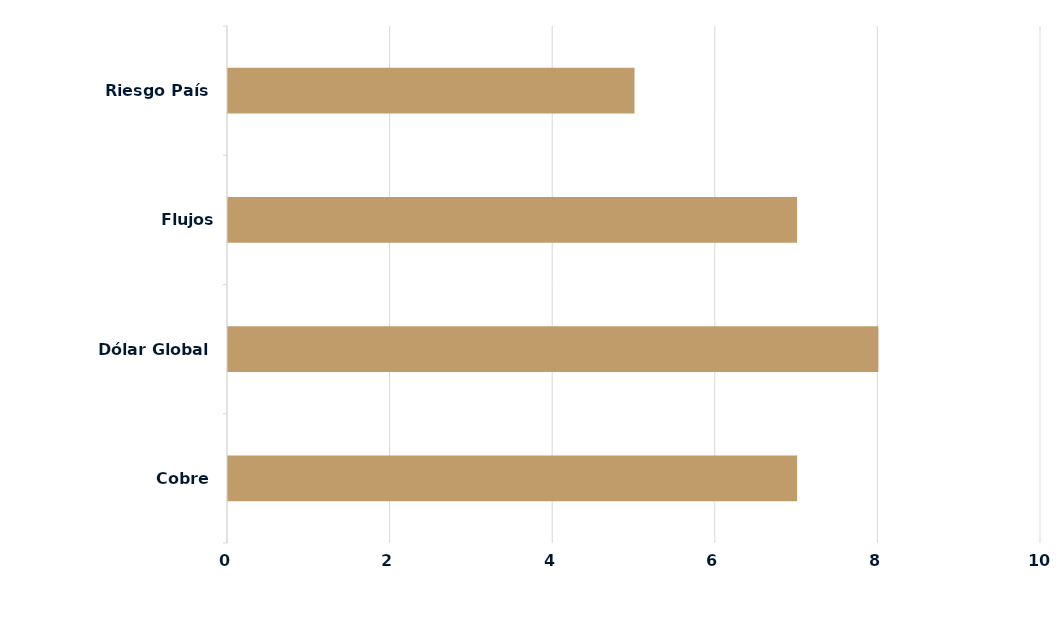
| Category | Series 0 |
|---|---|
| Cobre | 7 |
| Dólar Global | 8 |
| Flujos Locales/Extranjeros | 7 |
| Riesgo País | 5 |